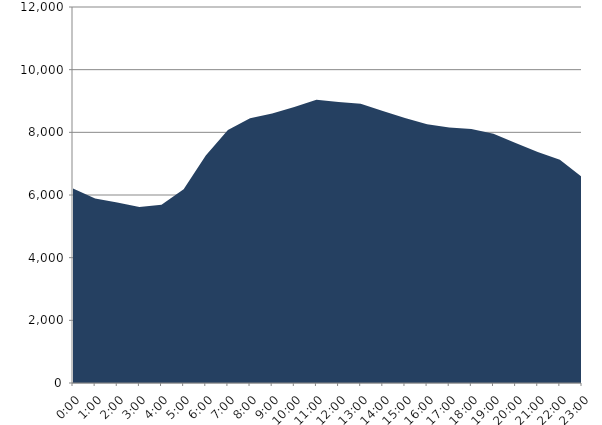
| Category | Series 0 | Series 1 |
|---|---|---|
| 2020-06-17 |  | 6205.736 |
| 2020-06-17 01:00:00 |  | 5889.981 |
| 2020-06-17 02:00:00 |  | 5757.673 |
| 2020-06-17 03:00:00 |  | 5619.252 |
| 2020-06-17 04:00:00 |  | 5692.237 |
| 2020-06-17 05:00:00 |  | 6187.425 |
| 2020-06-17 06:00:00 |  | 7258.687 |
| 2020-06-17 07:00:00 |  | 8074.158 |
| 2020-06-17 08:00:00 |  | 8446.262 |
| 2020-06-17 09:00:00 |  | 8597.725 |
| 2020-06-17 10:00:00 |  | 8808.093 |
| 2020-06-17 11:00:00 |  | 9041.744 |
| 2020-06-17 12:00:00 |  | 8967.931 |
| 2020-06-17 13:00:00 |  | 8912.161 |
| 2020-06-17 14:00:00 |  | 8681.48 |
| 2020-06-17 15:00:00 |  | 8459.75 |
| 2020-06-17 16:00:00 |  | 8257.326 |
| 2020-06-17 17:00:00 |  | 8152.327 |
| 2020-06-17 18:00:00 |  | 8109.545 |
| 2020-06-17 19:00:00 |  | 7951.148 |
| 2020-06-17 20:00:00 |  | 7660.091 |
| 2020-06-17 21:00:00 |  | 7374.921 |
| 2020-06-17 22:00:00 |  | 7123.977 |
| 2020-06-17 23:00:00 |  | 6571.529 |